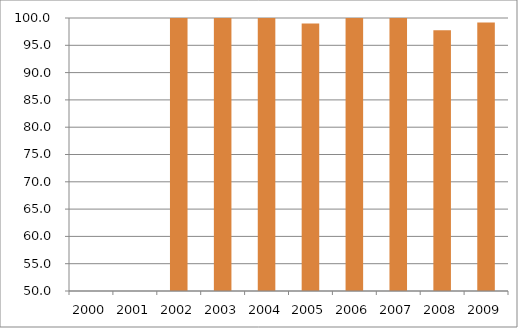
| Category | Região Sudeste |
|---|---|
| 2000.0 | 0 |
| 2001.0 | 0 |
| 2002.0 | 101.6 |
| 2003.0 | 114.86 |
| 2004.0 | 103.55 |
| 2005.0 | 99 |
| 2006.0 | 99.98 |
| 2007.0 | 101.06 |
| 2008.0 | 97.77 |
| 2009.0 | 99.19 |